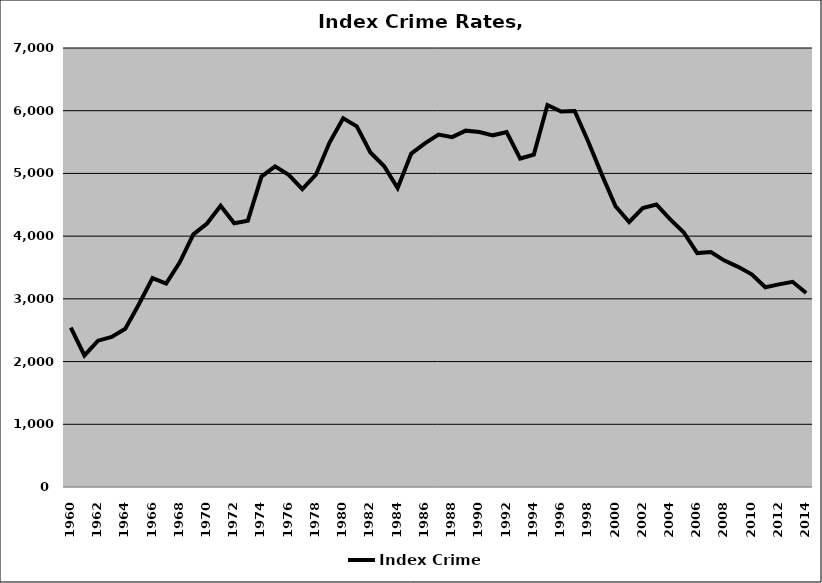
| Category | Index Crime |
|---|---|
| 1960.0 | 2541.356 |
| 1961.0 | 2097.162 |
| 1962.0 | 2332.885 |
| 1963.0 | 2392.37 |
| 1964.0 | 2523.891 |
| 1965.0 | 2913.636 |
| 1966.0 | 3330.258 |
| 1967.0 | 3244.434 |
| 1968.0 | 3581.915 |
| 1969.0 | 4027.943 |
| 1970.0 | 4201.655 |
| 1971.0 | 4485.805 |
| 1972.0 | 4206.394 |
| 1973.0 | 4247.105 |
| 1974.0 | 4950.213 |
| 1975.0 | 5112.604 |
| 1976.0 | 4977.769 |
| 1977.0 | 4750.631 |
| 1978.0 | 4978.883 |
| 1979.0 | 5492.026 |
| 1980.0 | 5880.599 |
| 1981.0 | 5750 |
| 1982.0 | 5334.041 |
| 1983.0 | 5117.912 |
| 1984.0 | 4766.223 |
| 1985.0 | 5317.325 |
| 1986.0 | 5478.378 |
| 1987.0 | 5618.631 |
| 1988.0 | 5578.533 |
| 1989.0 | 5682.132 |
| 1990.0 | 5659.924 |
| 1991.0 | 5607.627 |
| 1992.0 | 5658.522 |
| 1993.0 | 5237.366 |
| 1994.0 | 5300.943 |
| 1995.0 | 6090.825 |
| 1996.0 | 5985.85 |
| 1997.0 | 5995.483 |
| 1998.0 | 5505.905 |
| 1999.0 | 4976.862 |
| 2000.0 | 4476.061 |
| 2001.0 | 4226.379 |
| 2002.0 | 4447.537 |
| 2003.0 | 4505.427 |
| 2004.0 | 4271.849 |
| 2005.0 | 4062.025 |
| 2006.0 | 3730.261 |
| 2007.0 | 3748.039 |
| 2008.0 | 3609.997 |
| 2009.0 | 3510.378 |
| 2010.0 | 3392.29 |
| 2011.0 | 3184.789 |
| 2012.0 | 3230.374 |
| 2013.0 | 3271.959 |
| 2014.0 | 3094.123 |